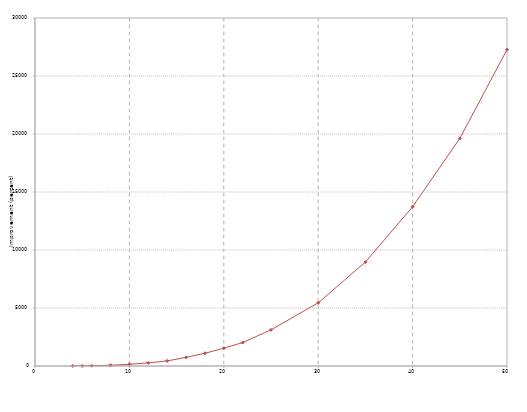
| Category | Series 1 |
|---|---|
| 4.0 | 5.5 |
| 5.0 | 11.2 |
| 6.0 | 25 |
| 8.0 | 66.3 |
| 10.0 | 149.1 |
| 12.0 | 268.7 |
| 14.0 | 438.4 |
| 16.0 | 742.2 |
| 18.0 | 1097.7 |
| 20.0 | 1532.1 |
| 22.0 | 2019 |
| 25.0 | 3117.8 |
| 30.0 | 5447 |
| 35.0 | 8957.8 |
| 40.0 | 13731.5 |
| 45.0 | 19615.2 |
| 50.0 | 27270.9 |